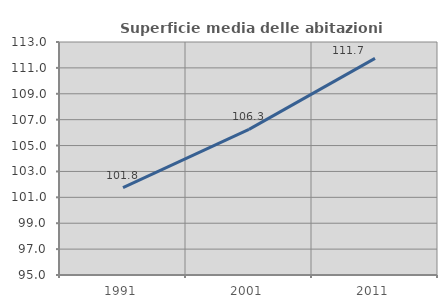
| Category | Superficie media delle abitazioni occupate |
|---|---|
| 1991.0 | 101.757 |
| 2001.0 | 106.25 |
| 2011.0 | 111.735 |